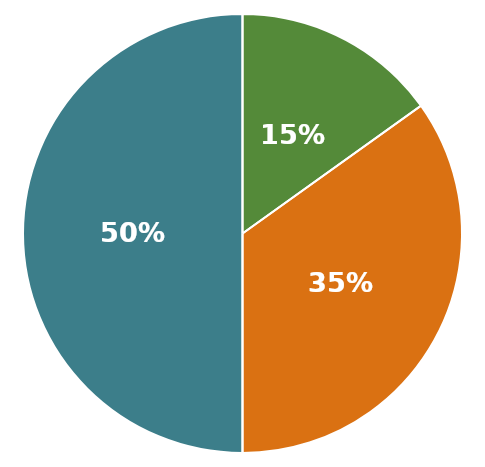
| Category | Total Aktiver |
|---|---|
| 0 | 1902500 |
| 1 | 575000 |
| 2 | 1327500 |